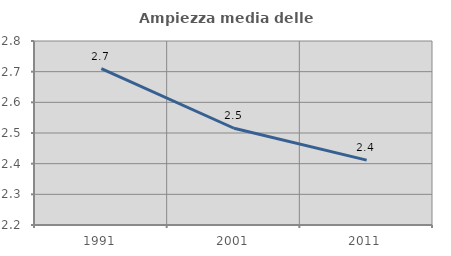
| Category | Ampiezza media delle famiglie |
|---|---|
| 1991.0 | 2.71 |
| 2001.0 | 2.516 |
| 2011.0 | 2.412 |